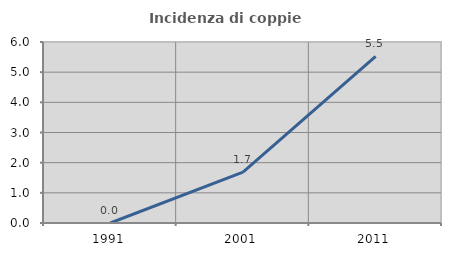
| Category | Incidenza di coppie miste |
|---|---|
| 1991.0 | 0 |
| 2001.0 | 1.685 |
| 2011.0 | 5.521 |